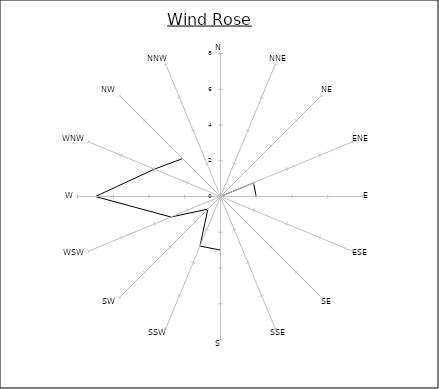
| Category | Series 0 |
|---|---|
| N | 1 |
| NNE | 0 |
| NE | 0 |
| ENE | 2 |
| E | 2 |
| ESE | 0 |
| SE | 1 |
| SSE | 0 |
| S | 3 |
| SSW | 3 |
| SW | 1 |
| WSW | 3 |
| W | 7 |
| WNW | 4 |
| NW | 3 |
| NNW | 0 |